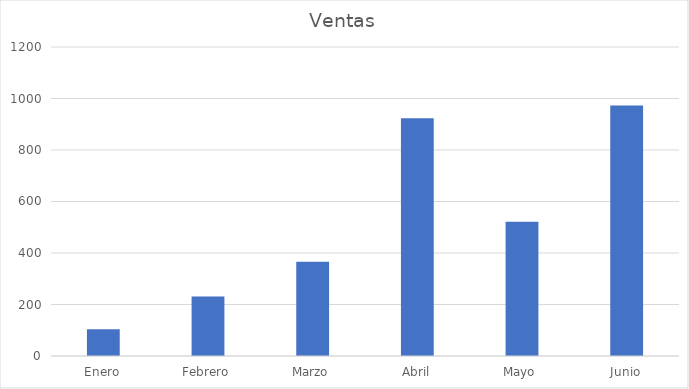
| Category | Ventas |
|---|---|
| Enero | 104 |
| Febrero | 231 |
| Marzo | 366 |
| Abril | 923 |
| Mayo | 521 |
| Junio | 973 |